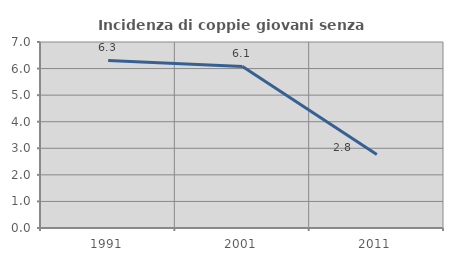
| Category | Incidenza di coppie giovani senza figli |
|---|---|
| 1991.0 | 6.308 |
| 2001.0 | 6.079 |
| 2011.0 | 2.763 |